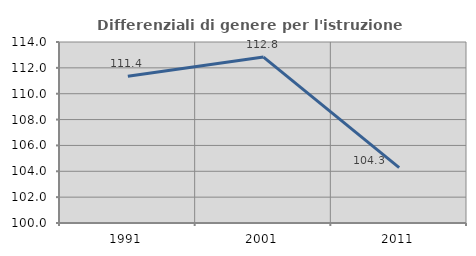
| Category | Differenziali di genere per l'istruzione superiore |
|---|---|
| 1991.0 | 111.351 |
| 2001.0 | 112.833 |
| 2011.0 | 104.28 |